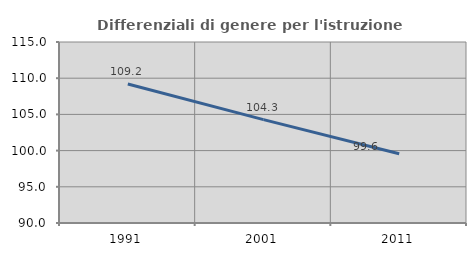
| Category | Differenziali di genere per l'istruzione superiore |
|---|---|
| 1991.0 | 109.192 |
| 2001.0 | 104.278 |
| 2011.0 | 99.554 |